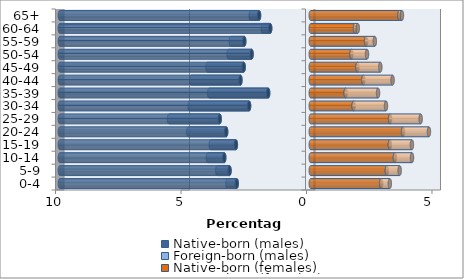
| Category | Native-born (males) | Foreign-born (males) | Native-born (females) | Foreign-born (females) |
|---|---|---|---|---|
| 0-4 | -2.95 | -0.368 | 2.806 | 0.344 |
| 5-9 | -3.237 | -0.488 | 3.031 | 0.512 |
| 10-14 | -3.447 | -0.65 | 3.351 | 0.684 |
| 15-19 | -2.983 | -0.999 | 3.151 | 0.88 |
| 20-24 | -3.37 | -1.506 | 3.676 | 1.033 |
| 25-29 | -3.629 | -2.017 | 3.16 | 1.219 |
| 30-34 | -2.457 | -2.366 | 1.707 | 1.291 |
| 35-39 | -1.697 | -2.347 | 1.391 | 1.291 |
| 40-44 | -2.802 | -1.96 | 2.094 | 1.167 |
| 45-49 | -2.672 | -1.439 | 1.86 | 0.913 |
| 50-54 | -2.357 | -0.913 | 1.621 | 0.622 |
| 55-59 | -2.649 | -0.535 | 2.204 | 0.349 |
| 60-64 | -1.616 | -0.292 | 1.764 | 0.11 |
| 65+ | -2.061 | -0.33 | 3.533 | 0.1 |